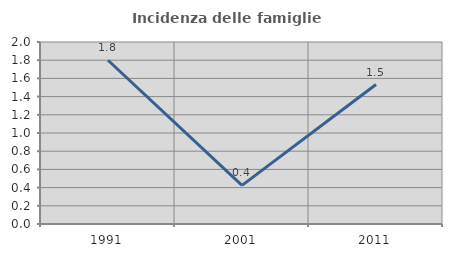
| Category | Incidenza delle famiglie numerose |
|---|---|
| 1991.0 | 1.799 |
| 2001.0 | 0.425 |
| 2011.0 | 1.533 |